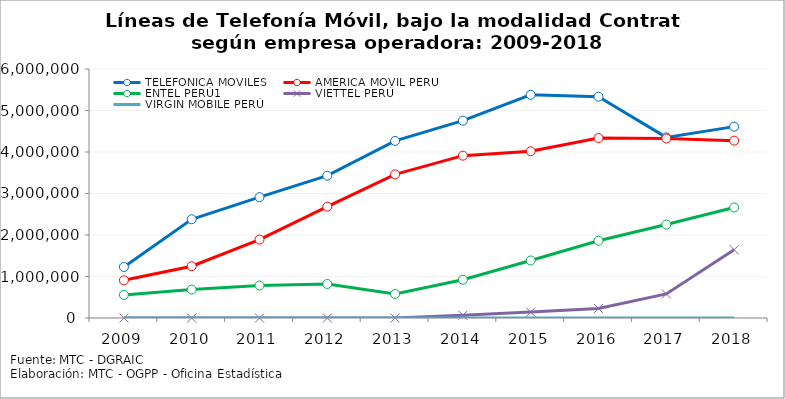
| Category | TELEFÓNICA MÓVILES | AMÉRICA MÓVIL PERÚ | ENTEL PERÚ1 | VIETTEL PERÚ | VIRGIN MOBILE PERÚ |
|---|---|---|---|---|---|
| 2009.0 | 1229234 | 907960 | 557076 | 0 | 0 |
| 2010.0 | 2379455 | 1247694 | 684783 | 0 | 0 |
| 2011.0 | 2911894 | 1889460 | 782616 | 0 | 0 |
| 2012.0 | 3428986 | 2683021 | 820771 | 0 | 0 |
| 2013.0 | 4266655 | 3461527 | 578590 | 0 | 0 |
| 2014.0 | 4754867 | 3911921 | 922358 | 65142 | 0 |
| 2015.0 | 5378203 | 4017780 | 1385839 | 142058 | 0 |
| 2016.0 | 5332322 | 4336862 | 1861395 | 230955 | 0 |
| 2017.0 | 4352053 | 4325136 | 2251647 | 580804 | 0 |
| 2018.0 | 4611028 | 4273489 | 2663440 | 1645183 | 0 |